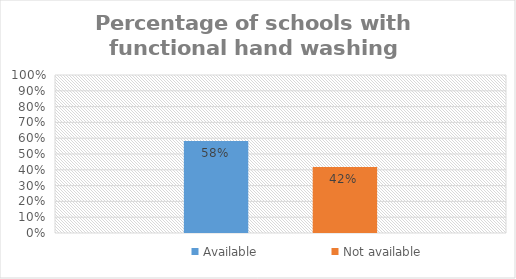
| Category | Available | Not available |
|---|---|---|
| 0 | 0.582 | 0.418 |